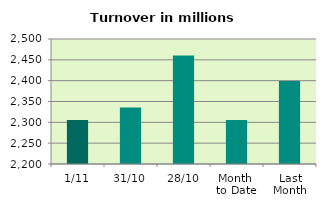
| Category | Series 0 |
|---|---|
| 1/11 | 2305.307 |
| 31/10 | 2335.507 |
| 28/10 | 2460.399 |
| Month 
to Date | 2305.307 |
| Last
Month | 2399.244 |